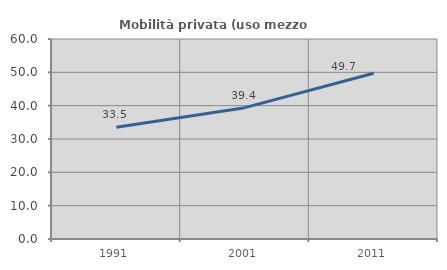
| Category | Mobilità privata (uso mezzo privato) |
|---|---|
| 1991.0 | 33.547 |
| 2001.0 | 39.401 |
| 2011.0 | 49.722 |